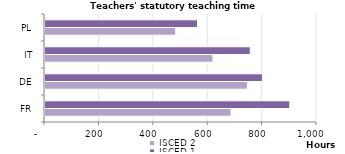
| Category | ISCED 2 | ISCED 1 |
|---|---|---|
| FR | 684 | 900 |
| DE | 743.769 | 799.543 |
| IT | 617.4 | 754.6 |
| PL | 480.6 | 560.7 |